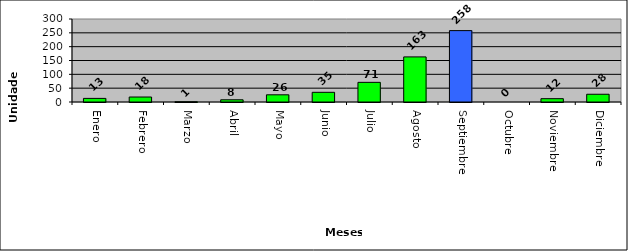
| Category | Mariguana plantas |
|---|---|
| Enero | 13 |
| Febrero | 18 |
| Marzo | 1 |
| Abril | 8 |
| Mayo | 26 |
| Junio | 35 |
| Julio | 71 |
| Agosto | 163 |
| Septiembre | 258 |
| Octubre | 0 |
| Noviembre | 12 |
| Diciembre | 28 |